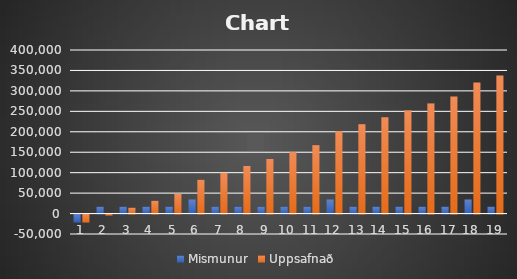
| Category | Mismunur | Uppsafnað |
|---|---|---|
| 1.0 | -19569.84 | -19569.84 |
| 2.0 | 16930.16 | -2639.68 |
| 3.0 | 16930.16 | 14290.48 |
| 4.0 | 16930.16 | 31220.64 |
| 5.0 | 16930.16 | 48150.8 |
| 6.0 | 34430.16 | 82580.96 |
| 7.0 | 16930.16 | 99511.12 |
| 8.0 | 16930.16 | 116441.28 |
| 9.0 | 16930.16 | 133371.44 |
| 10.0 | 16930.16 | 150301.6 |
| 11.0 | 16930.16 | 167231.76 |
| 12.0 | 34430.16 | 201661.92 |
| 13.0 | 16930.16 | 218592.08 |
| 14.0 | 16930.16 | 235522.24 |
| 15.0 | 16930.16 | 252452.4 |
| 16.0 | 16930.16 | 269382.56 |
| 17.0 | 16930.16 | 286312.72 |
| 18.0 | 34430.16 | 320742.88 |
| 19.0 | 16930.16 | 337673.04 |